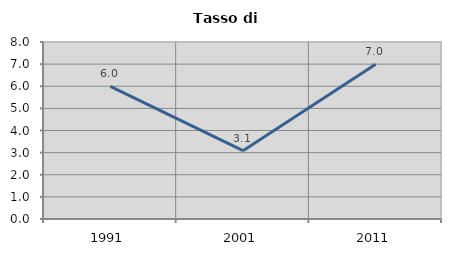
| Category | Tasso di disoccupazione   |
|---|---|
| 1991.0 | 5.995 |
| 2001.0 | 3.088 |
| 2011.0 | 6.997 |